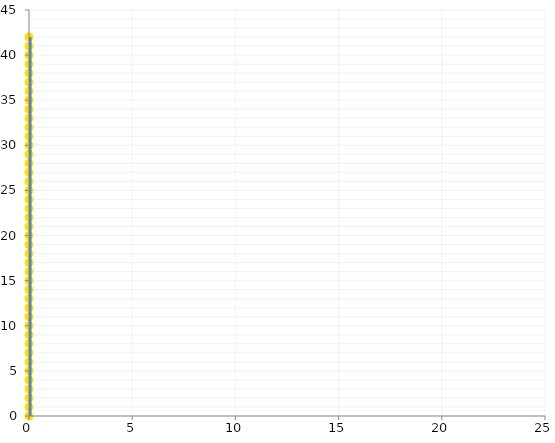
| Category | Series 0 |
|---|---|
| 0.0 |  |
| 1.0 |  |
| 2.0 |  |
| 3.0 |  |
| 4.0 |  |
| 5.0 |  |
| 6.0 |  |
| 7.0 |  |
| 8.0 |  |
| 9.0 |  |
| 10.0 |  |
| 11.0 |  |
| 12.0 |  |
| 13.0 |  |
| 14.0 |  |
| 15.0 |  |
| 16.0 |  |
| 17.0 |  |
| 18.0 |  |
| 19.0 |  |
| 20.0 |  |